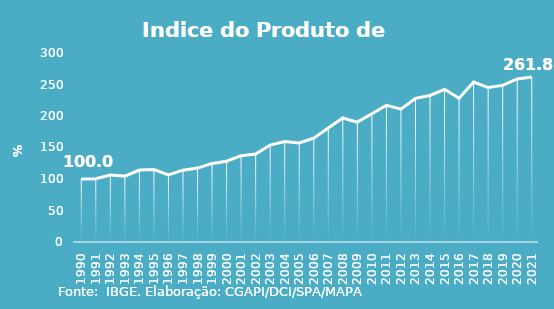
| Category | Indice de Prod. base 1990 |
|---|---|
| 1990.0 | 100 |
| 1991.0 | 100.275 |
| 1992.0 | 106.203 |
| 1993.0 | 104.57 |
| 1994.0 | 114.164 |
| 1995.0 | 115.024 |
| 1996.0 | 106.552 |
| 1997.0 | 114.037 |
| 1998.0 | 117.319 |
| 1999.0 | 124.734 |
| 2000.0 | 128.293 |
| 2001.0 | 136.975 |
| 2002.0 | 139.51 |
| 2003.0 | 153.868 |
| 2004.0 | 159.641 |
| 2005.0 | 157.136 |
| 2006.0 | 164.858 |
| 2007.0 | 180.781 |
| 2008.0 | 196.91 |
| 2009.0 | 190.309 |
| 2010.0 | 203.581 |
| 2011.0 | 217.041 |
| 2012.0 | 210.932 |
| 2013.0 | 228.009 |
| 2014.0 | 232.562 |
| 2015.0 | 242.318 |
| 2016.0 | 228.239 |
| 2017.0 | 253.826 |
| 2018.0 | 245.134 |
| 2019.0 | 248.619 |
| 2020.0 | 258.848 |
| 2021.0 | 261.818 |